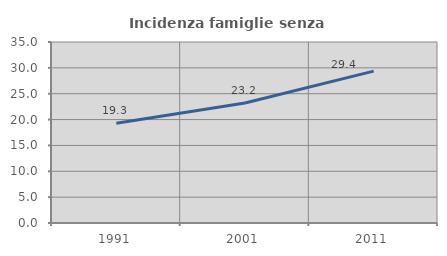
| Category | Incidenza famiglie senza nuclei |
|---|---|
| 1991.0 | 19.292 |
| 2001.0 | 23.192 |
| 2011.0 | 29.373 |